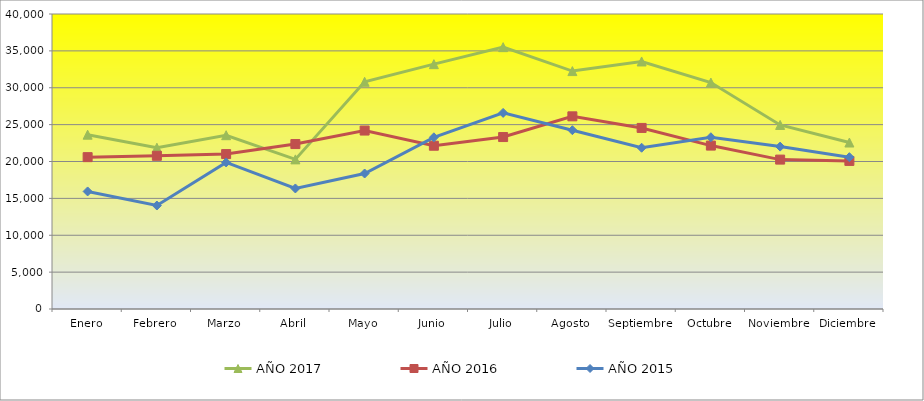
| Category | AÑO 2017 | AÑO 2016 | AÑO 2015 |
|---|---|---|---|
| Enero | 23636.209 | 20590 | 15940 |
| Febrero | 21870.542 | 20773 | 14031 |
| Marzo | 23564.495 | 21005 | 19871 |
| Abril | 20287.87 | 22365 | 16344 |
| Mayo | 30808.69 | 24195 | 18371 |
| Junio | 33198.036 | 22138 | 23278 |
| Julio | 35505.833 | 23315 | 26590 |
| Agosto | 32260.238 | 26124 | 24244 |
| Septiembre | 33565 | 24551 | 21865 |
| Octubre | 30701.648 | 22157 | 23290 |
| Noviembre | 24959.231 | 20258 | 22019 |
| Diciembre | 22572.381 | 20078 | 20587 |